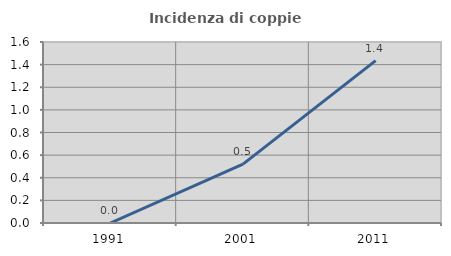
| Category | Incidenza di coppie miste |
|---|---|
| 1991.0 | 0 |
| 2001.0 | 0.521 |
| 2011.0 | 1.435 |